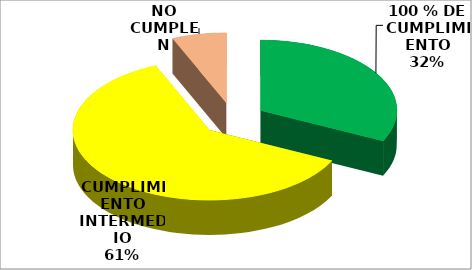
| Category | Series 0 |
|---|---|
| 100 % DE CUMPLIMIENTO | 140 |
| CUMPLIMIENTO INTERMEDIO | 267 |
| NO CUMPLEN | 28 |